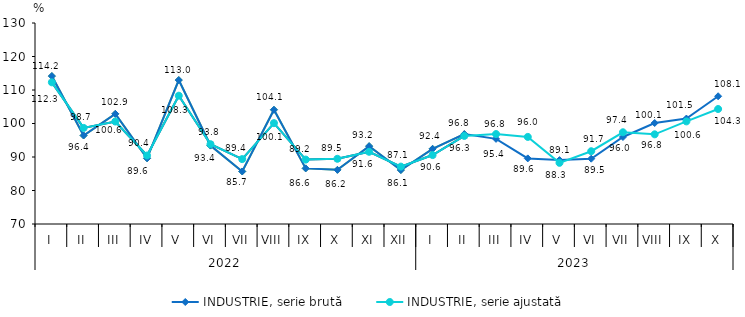
| Category | INDUSTRIE, serie brută | INDUSTRIE, serie ajustată |
|---|---|---|
| 0 | 114.151 | 112.283 |
| 1 | 96.419 | 98.68 |
| 2 | 102.886 | 100.594 |
| 3 | 89.614 | 90.447 |
| 4 | 112.973 | 108.294 |
| 5 | 93.417 | 93.82 |
| 6 | 85.678 | 89.372 |
| 7 | 104.099 | 100.102 |
| 8 | 86.603 | 89.228 |
| 9 | 86.164 | 89.466 |
| 10 | 93.241 | 91.558 |
| 11 | 86.103 | 87.134 |
| 12 | 92.442 | 90.58 |
| 13 | 96.83 | 96.297 |
| 14 | 95.412 | 96.841 |
| 15 | 89.583 | 95.998 |
| 16 | 89.076 | 88.254 |
| 17 | 89.492 | 91.722 |
| 18 | 95.973 | 97.381 |
| 19 | 100.143 | 96.768 |
| 20 | 101.47 | 100.634 |
| 21 | 108.132 | 104.324 |